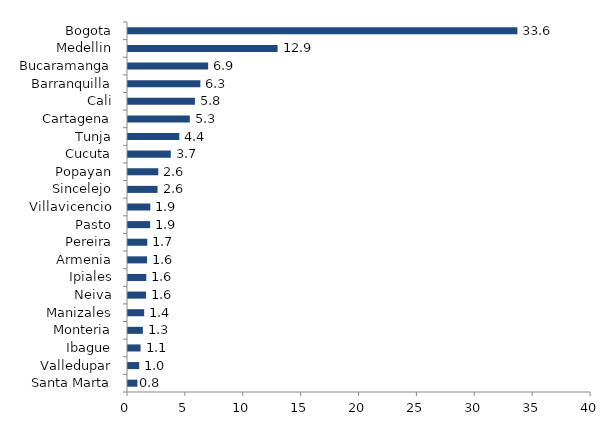
| Category | Series 0 |
|---|---|
| Santa Marta | 0.813 |
| Valledupar | 0.969 |
| Ibague | 1.084 |
| Monteria | 1.287 |
| Manizales | 1.398 |
| Neiva | 1.554 |
| Ipiales | 1.58 |
| Armenia | 1.648 |
| Pereira | 1.666 |
| Pasto | 1.912 |
| Villavicencio | 1.928 |
| Sincelejo | 2.553 |
| Popayan | 2.616 |
| Cucuta | 3.696 |
| Tunja | 4.435 |
| Cartagena | 5.339 |
| Cali | 5.783 |
| Barranquilla | 6.25 |
| Bucaramanga | 6.925 |
| Medellin | 12.922 |
| Bogota | 33.642 |